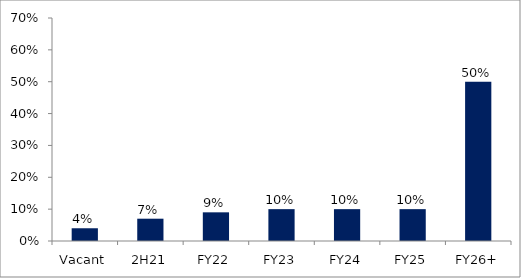
| Category | Series 0 |
|---|---|
| Vacant | 0.04 |
| 2H21 | 0.07 |
| FY22 | 0.09 |
| FY23 | 0.1 |
| FY24 | 0.1 |
| FY25 | 0.1 |
| FY26+ | 0.5 |